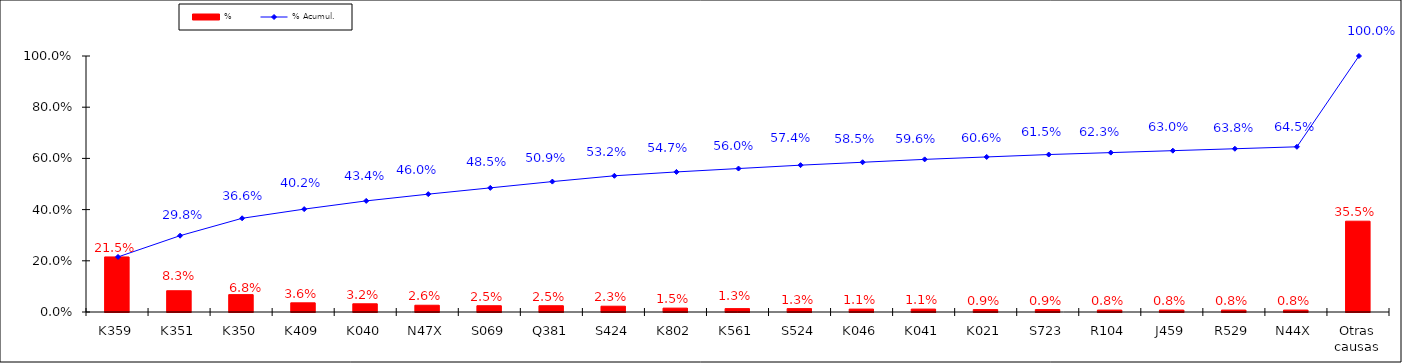
| Category | % |
|---|---|
| K359 | 0.215 |
| K351 | 0.083 |
| K350 | 0.068 |
| K409 | 0.036 |
| K040 | 0.032 |
| N47X | 0.026 |
| S069 | 0.025 |
| Q381 | 0.025 |
| S424 | 0.023 |
| K802 | 0.015 |
| K561 | 0.013 |
| S524 | 0.013 |
| K046 | 0.011 |
| K041 | 0.011 |
| K021 | 0.009 |
| S723 | 0.009 |
| R104 | 0.008 |
| J459 | 0.008 |
| R529 | 0.008 |
| N44X | 0.008 |
| Otras causas | 0.355 |